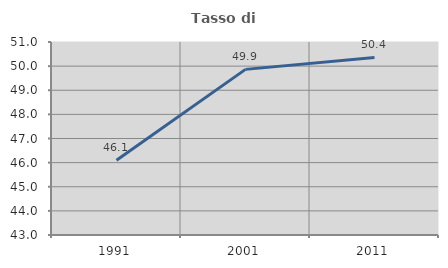
| Category | Tasso di occupazione   |
|---|---|
| 1991.0 | 46.094 |
| 2001.0 | 49.865 |
| 2011.0 | 50.362 |